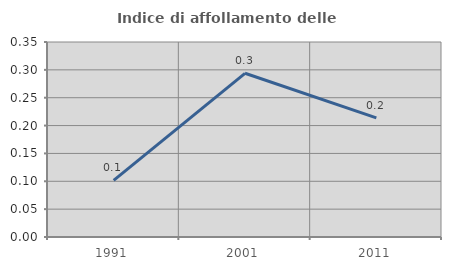
| Category | Indice di affollamento delle abitazioni  |
|---|---|
| 1991.0 | 0.102 |
| 2001.0 | 0.294 |
| 2011.0 | 0.214 |